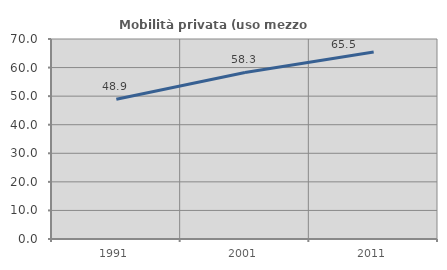
| Category | Mobilità privata (uso mezzo privato) |
|---|---|
| 1991.0 | 48.908 |
| 2001.0 | 58.294 |
| 2011.0 | 65.471 |